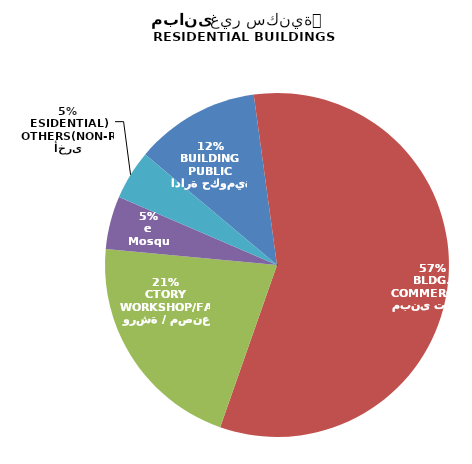
| Category | مبانى غير سكنية
NON RESIDENTIAL BUILDINGS |
|---|---|
| ادارة حكومية
PUBLIC BUILDING | 106 |
| مبنى تجاري
COMMERCIAL BLDG. | 520 |
| ورشة / مصنع
WORKSHOP/FACTORY | 191 |
| مسجد
Mosque | 45 |
| أخرى
OTHERS(NON-RESIDENTIAL) | 42 |